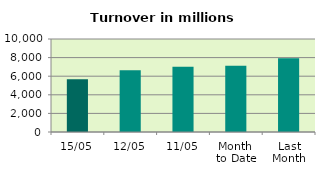
| Category | Series 0 |
|---|---|
| 15/05 | 5682.626 |
| 12/05 | 6641.849 |
| 11/05 | 7010.287 |
| Month 
to Date | 7136.869 |
| Last
Month | 7939.051 |